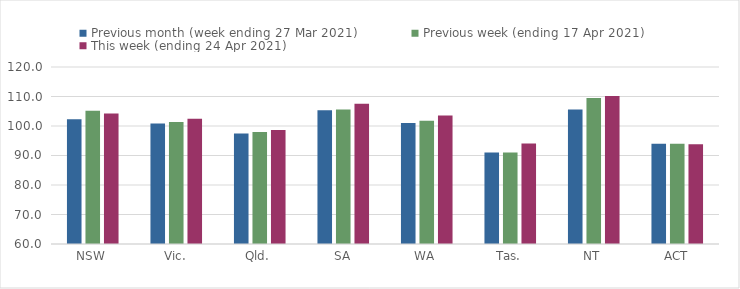
| Category | Previous month (week ending 27 Mar 2021) | Previous week (ending 17 Apr 2021) | This week (ending 24 Apr 2021) |
|---|---|---|---|
| NSW | 102.26 | 105.17 | 104.27 |
| Vic. | 100.82 | 101.32 | 102.45 |
| Qld. | 97.42 | 97.93 | 98.65 |
| SA | 105.37 | 105.59 | 107.54 |
| WA | 101.05 | 101.81 | 103.58 |
| Tas. | 91.01 | 91.01 | 94.04 |
| NT | 105.58 | 109.47 | 110.17 |
| ACT | 94 | 94 | 93.84 |